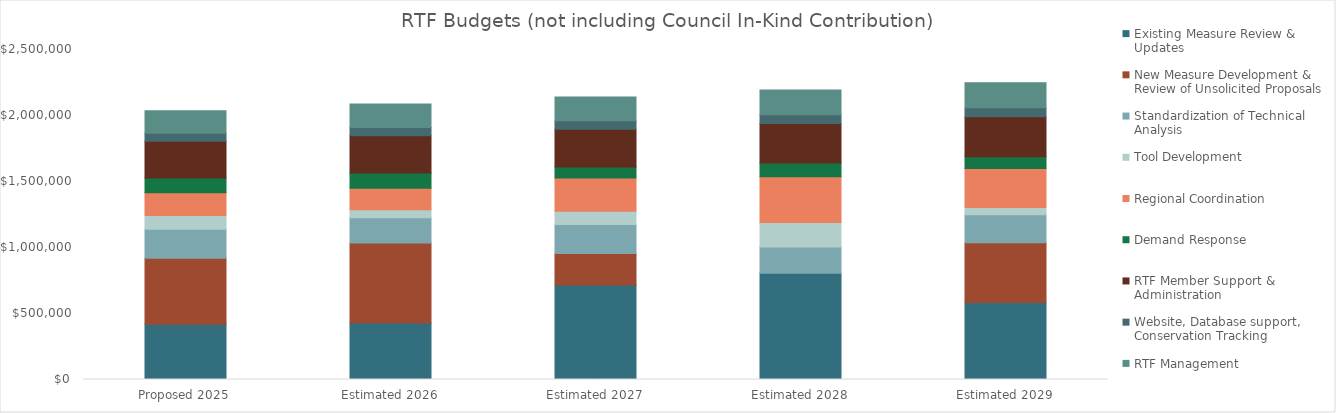
| Category | Existing Measure Review & Updates | New Measure Development & Review of Unsolicited Proposals | Standardization of Technical Analysis | Tool Development | Regional Coordination | Demand Response | RTF Member Support & Administration | Website, Database support, Conservation Tracking  | RTF Management |
|---|---|---|---|---|---|---|---|---|---|
| Proposed 2025 | 418000 | 500500 | 219500 | 105000 | 172600 | 110500 | 278200 | 61700 | 170500 |
| Estimated 2026 | 428450 | 606450 | 191100 | 60000 | 163800 | 114300 | 282100 | 63200 | 178000 |
| Estimated 2027 | 716100 | 239000 | 218800 | 100000 | 252000 | 83400 | 286000 | 64800 | 179500 |
| Estimated 2028 | 805800 | 0 | 198600 | 185000 | 347100 | 103700 | 299500 | 66400 | 187000 |
| Estimated 2029 | 583200 | 452700 | 212200 | 55000 | 294700 | 89300 | 304200 | 68100 | 188500 |